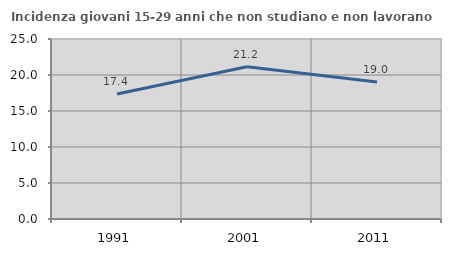
| Category | Incidenza giovani 15-29 anni che non studiano e non lavorano  |
|---|---|
| 1991.0 | 17.367 |
| 2001.0 | 21.156 |
| 2011.0 | 19.016 |